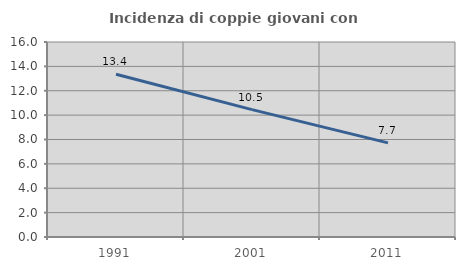
| Category | Incidenza di coppie giovani con figli |
|---|---|
| 1991.0 | 13.351 |
| 2001.0 | 10.451 |
| 2011.0 | 7.725 |